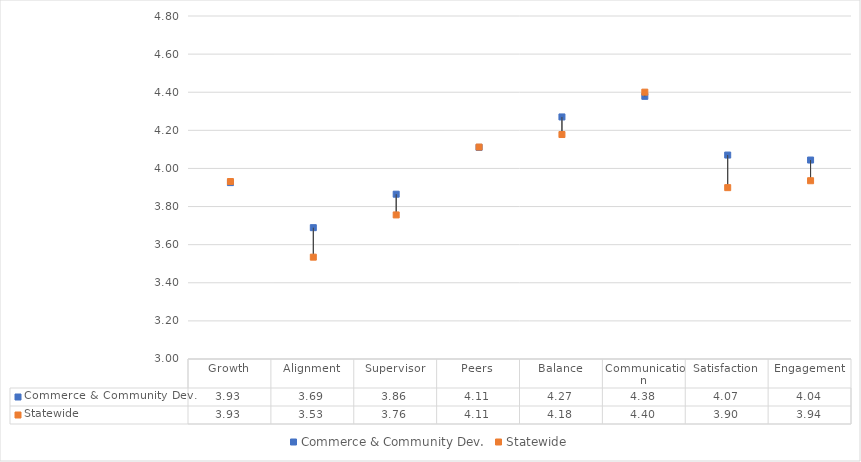
| Category | Commerce & Community Dev. | Statewide |
|---|---|---|
| Growth | 3.926 | 3.931 |
| Alignment | 3.689 | 3.534 |
| Supervisor | 3.865 | 3.756 |
| Peers | 4.11 | 4.112 |
| Balance | 4.27 | 4.178 |
| Communication | 4.378 | 4.4 |
| Satisfaction | 4.07 | 3.899 |
| Engagement | 4.044 | 3.936 |